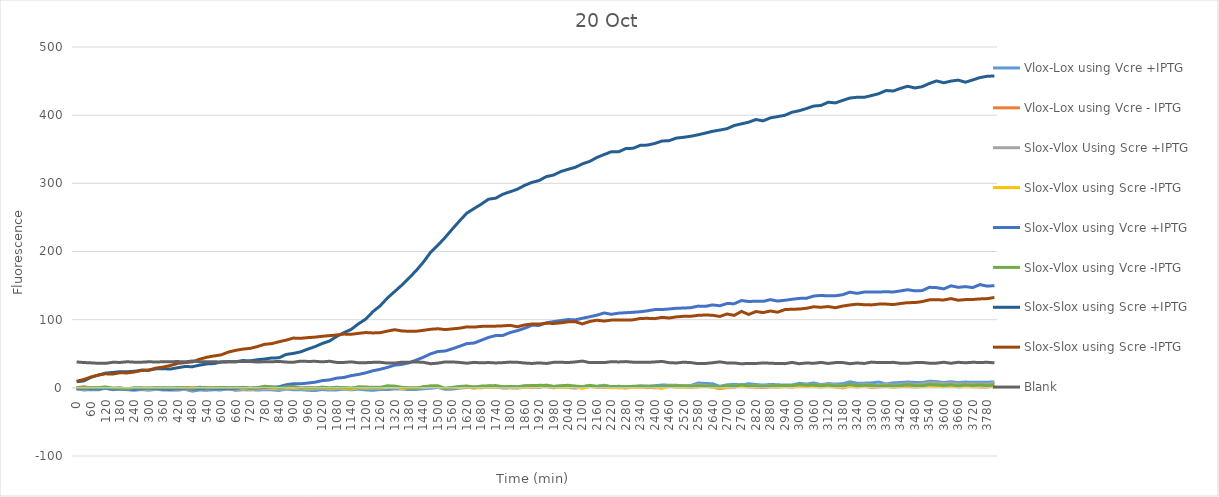
| Category | Vlox-Lox using Vcre +IPTG | Vlox-Lox using Vcre - IPTG | Slox-Vlox Using Scre +IPTG | Slox-Vlox using Scre -IPTG | Slox-Vlox using Vcre +IPTG | Slox-Vlox using Vcre -IPTG | Slox-Slox using Scre +IPTG | Slox-Slox using Scre -IPTG | Blank |
|---|---|---|---|---|---|---|---|---|---|
| 0.0 | -1.75 | 0.125 | -1.667 | -0.417 | -0.75 | 0.417 | 9 | 9.583 | 38 |
| 30.0 | -3.125 | 1.625 | -2.542 | -0.958 | -1.458 | -0.375 | 10.125 | 12.292 | 37.125 |
| 60.0 | -2.75 | -0.25 | -1.708 | 0.125 | -1.542 | 0.125 | 15.542 | 15.875 | 36.625 |
| 90.0 | -3 | -0.5 | -1.333 | 0.5 | -1.333 | 0.167 | 18.667 | 18.75 | 36 |
| 120.0 | -0.375 | 0.75 | -0.292 | 0.875 | -0.292 | 1.208 | 21.625 | 20.542 | 35.875 |
| 150.0 | -2.75 | -1.5 | -2.25 | -1.75 | -2.167 | -0.333 | 22.5 | 20.167 | 37.5 |
| 180.0 | -1.75 | 0 | -1.667 | -1.25 | -1.667 | -0.417 | 23.75 | 22.167 | 37.25 |
| 210.0 | -2.75 | -1.75 | -2.25 | -1.333 | -2.167 | -1.583 | 23.583 | 21.833 | 38.25 |
| 240.0 | -3.625 | -1.375 | -2.542 | -1.208 | -2.375 | 0.292 | 24.292 | 23.292 | 37.625 |
| 270.0 | -2 | -0.5 | -2.875 | -0.958 | -1.208 | -0.042 | 26.042 | 25.375 | 37.625 |
| 300.0 | -3.5 | -0.625 | -2.583 | -0.667 | -1.083 | -0.25 | 25.833 | 26.083 | 38.25 |
| 330.0 | -2 | -0.625 | -1.125 | -0.458 | -0.792 | 0.125 | 27.875 | 29.042 | 37.875 |
| 360.0 | -3.25 | -1.125 | -2.417 | -0.25 | -2.083 | 0 | 28 | 30.5 | 38.25 |
| 390.0 | -3.25 | -0.5 | -2.708 | -1.125 | -2.375 | 0.125 | 27.625 | 32.792 | 38.375 |
| 420.0 | -3.125 | -0.625 | -3 | -0.25 | -1.25 | 0.333 | 29.5 | 35.833 | 38.5 |
| 450.0 | -2.25 | 0.625 | -2.042 | -0.875 | -1.042 | -0.208 | 31.292 | 37.042 | 38.125 |
| 480.0 | -4.875 | 0 | -3.458 | -1.875 | -2.292 | -0.875 | 30.958 | 37.958 | 39.375 |
| 510.0 | -3.25 | 0 | -1.75 | -1.583 | -1.583 | 0.833 | 33.25 | 41.917 | 38.25 |
| 540.0 | -3.5 | -1.75 | -1.333 | 0.083 | -0.5 | 0.25 | 35.083 | 44.833 | 38.25 |
| 570.0 | -2.875 | 0.625 | -1.458 | -0.458 | -1.375 | -0.125 | 35.625 | 46.792 | 38.375 |
| 600.0 | -3.125 | -0.25 | -1.583 | 0.417 | -1.083 | 0.583 | 38 | 48.333 | 37.75 |
| 630.0 | -1.25 | 0.25 | -1.708 | 0.042 | -1.208 | 0.208 | 38.458 | 52.458 | 38.125 |
| 660.0 | -3.5 | 0.125 | -3.125 | -0.792 | -1.208 | -0.042 | 38.208 | 54.958 | 38.375 |
| 690.0 | -2.75 | -1 | -2.458 | 0.125 | 0.708 | 0.458 | 40.042 | 56.792 | 38.625 |
| 720.0 | -2.625 | -1.625 | -2.875 | -1.875 | -0.542 | -0.292 | 39.542 | 57.875 | 38.625 |
| 750.0 | -3.25 | -0.375 | -1.958 | -0.375 | -0.042 | 0.292 | 41.208 | 60.458 | 37.875 |
| 780.0 | -2.75 | 0.5 | -1.917 | -0.083 | 0.417 | 2.333 | 42.25 | 63.833 | 38.25 |
| 810.0 | -2.875 | 0.375 | -1.5 | -0.583 | 1.167 | 1.417 | 43.833 | 64.833 | 38.25 |
| 840.0 | -3.875 | 0.25 | -2.167 | -0.5 | 1.5 | -0.417 | 44 | 67.583 | 38.75 |
| 870.0 | -1.75 | 0.625 | -1.583 | 0.667 | 4.583 | 1.417 | 49 | 70 | 37.75 |
| 900.0 | -2.75 | 1.875 | -0.5 | 0 | 6 | 1.833 | 50.5 | 73 | 37.5 |
| 930.0 | -2.625 | -0.625 | -1.875 | -0.292 | 5.875 | -0.292 | 52.792 | 72.625 | 39.125 |
| 960.0 | -3.625 | 0.375 | -2.167 | -0.667 | 7 | 0.25 | 56.833 | 73.667 | 38.75 |
| 990.0 | -4 | -0.5 | -1.708 | -0.542 | 8.292 | -0.125 | 60.458 | 74.375 | 38.875 |
| 1020.0 | -2.5 | -0.125 | -0.542 | 0.792 | 10.625 | 1.042 | 65.125 | 75.625 | 38.125 |
| 1050.0 | -3.25 | -1.5 | -1.75 | -1.083 | 11.583 | 0.083 | 68.667 | 76.583 | 39 |
| 1080.0 | -3 | -0.25 | -0.75 | 0.167 | 14.25 | 0.833 | 75.5 | 77.5 | 37.25 |
| 1110.0 | -1.875 | 0.25 | -0.75 | -0.833 | 15.25 | 0.083 | 81 | 78.833 | 37.25 |
| 1140.0 | -3 | -1 | -1.208 | -2.125 | 17.875 | -0.125 | 85.792 | 78.542 | 38.125 |
| 1170.0 | -1.875 | 1.25 | 0.083 | 0.417 | 19.667 | 1.083 | 93.917 | 79.917 | 36.75 |
| 1200.0 | -3 | 0.625 | -0.875 | -0.042 | 21.958 | 1.125 | 100.708 | 81.125 | 36.875 |
| 1230.0 | -3.75 | 0.5 | -0.542 | 0.125 | 25.042 | 0.875 | 111.708 | 80.542 | 37.375 |
| 1260.0 | -2.5 | -0.75 | -0.667 | 0.167 | 27.167 | 0.667 | 120.25 | 80.917 | 37.5 |
| 1290.0 | -2.625 | 1.375 | 0.417 | 1 | 29.917 | 3 | 131.667 | 83.167 | 36.25 |
| 1320.0 | -1.5 | 1.375 | 1.75 | 1.417 | 33.25 | 2.583 | 141.167 | 85.25 | 36.25 |
| 1350.0 | -1.75 | -0.125 | -0.208 | -1.375 | 34.375 | 0.792 | 150.625 | 83.542 | 37.625 |
| 1380.0 | -2.625 | -0.25 | 0.458 | 0.375 | 36.708 | -0.125 | 161.208 | 82.875 | 37.625 |
| 1410.0 | -2.375 | 0.125 | 0.333 | -0.25 | 40.75 | -0.5 | 172.083 | 83 | 38 |
| 1440.0 | -1.375 | 0.75 | 0.292 | 0.792 | 44.958 | 1.792 | 184.625 | 84.375 | 37.375 |
| 1470.0 | -0.5 | 2.625 | 1.875 | 2.292 | 49.958 | 2.708 | 199.042 | 85.958 | 35.375 |
| 1500.0 | 0.5 | 1.625 | 1.667 | 1.917 | 53.25 | 3.083 | 209.25 | 86.667 | 36.25 |
| 1530.0 | -2.125 | -1 | -0.417 | -1.083 | 54 | -1.167 | 220.667 | 85.417 | 38 |
| 1560.0 | -1.875 | 0.125 | 0.5 | 0.333 | 57.333 | 0.667 | 233 | 86.5 | 38 |
| 1590.0 | -0.375 | 0.375 | 0.917 | 0.583 | 61 | 2 | 245 | 87.5 | 37.25 |
| 1620.0 | 0.5 | 1.125 | 2.125 | 1.792 | 64.875 | 2.708 | 256.375 | 89.458 | 36.125 |
| 1650.0 | 0.125 | 0.5 | 1.458 | -0.792 | 65.708 | 0.875 | 262.958 | 89.125 | 37.375 |
| 1680.0 | 0.125 | 0.875 | 1.208 | 1.542 | 69.792 | 2.625 | 269.458 | 90.125 | 36.625 |
| 1710.0 | 1.125 | 0.625 | 2.708 | 0.792 | 73.958 | 2.875 | 276.708 | 90.375 | 37.125 |
| 1740.0 | 1.125 | 1.625 | 1.667 | 1.833 | 76.667 | 3.333 | 278.25 | 90.5 | 36.5 |
| 1770.0 | -0.25 | 0.75 | 1.083 | 0.833 | 76.917 | 1.5 | 284.083 | 90.917 | 37 |
| 1800.0 | 0 | 0.75 | 2 | 1 | 81.167 | 2.083 | 287.667 | 91.667 | 37.75 |
| 1830.0 | -0.375 | 0.375 | 1.25 | 0.417 | 83.917 | 1.667 | 291.417 | 89.583 | 37.5 |
| 1860.0 | 0.875 | 2.125 | 3.042 | 0.958 | 87.458 | 2.792 | 297.042 | 92.292 | 36.375 |
| 1890.0 | 2 | 0.625 | 3.25 | 2.25 | 91.75 | 3.417 | 301.333 | 93.583 | 35.75 |
| 1920.0 | 0.5 | 2 | 2.042 | 1.792 | 91.542 | 3.625 | 304.125 | 93.458 | 36.625 |
| 1950.0 | 2.625 | 1.625 | 4.083 | 2.583 | 95.417 | 3.583 | 309.917 | 94.75 | 35.75 |
| 1980.0 | 0 | 0.875 | 1.958 | 1.125 | 97.125 | 2.042 | 312.125 | 94.458 | 37.375 |
| 2010.0 | 1.125 | 1.625 | 2.667 | 0.833 | 98.667 | 3.083 | 317.333 | 95.333 | 37.5 |
| 2040.0 | 0.5 | 1.125 | 2.542 | 0.958 | 100.208 | 3.708 | 320.542 | 96.792 | 37.125 |
| 2070.0 | -0.375 | 0.875 | 1.667 | 1.5 | 99.667 | 2.583 | 323.5 | 96.917 | 38 |
| 2100.0 | 1.5 | 0.125 | 1.917 | -0.833 | 102.083 | 1.75 | 328.583 | 93.75 | 39.25 |
| 2130.0 | 2.25 | 2 | 2.5 | 2.25 | 104.25 | 3.667 | 332.167 | 97.333 | 37 |
| 2160.0 | 2 | 1 | 2.125 | 1.875 | 106.625 | 2.042 | 337.958 | 99.208 | 37.125 |
| 2190.0 | 3.75 | 0.625 | 3.167 | 1.417 | 109.833 | 2.667 | 342.25 | 97.917 | 37 |
| 2220.0 | 1.375 | 0.75 | 1.875 | -0.042 | 107.875 | 1.792 | 346.375 | 99.375 | 38.375 |
| 2250.0 | 2.25 | 0.125 | 1.083 | 0.583 | 109.583 | 2 | 346.25 | 99.583 | 38 |
| 2280.0 | 1.625 | -0.125 | 1.917 | 0.667 | 110.167 | 1.667 | 351 | 99.417 | 38.5 |
| 2310.0 | 0.875 | 0.875 | 1.708 | 0.625 | 110.875 | 2.208 | 351.375 | 99.708 | 37.625 |
| 2340.0 | 2.375 | 1.25 | 2.958 | 0.708 | 111.625 | 2.458 | 355.708 | 101.792 | 37.625 |
| 2370.0 | 2.25 | 0.5 | 2.542 | 1.625 | 112.958 | 1.625 | 356.125 | 101.958 | 37.375 |
| 2400.0 | 3.125 | 0.25 | 2 | 1.333 | 114.75 | 2.25 | 358.5 | 101.5 | 38 |
| 2430.0 | 4.125 | -0.25 | 1.5 | -0.667 | 114.833 | 2 | 362.083 | 103.417 | 38.75 |
| 2460.0 | 3.875 | 2.375 | 3.625 | 2.042 | 115.708 | 2.792 | 362.625 | 102.458 | 36.875 |
| 2490.0 | 3.875 | 1.25 | 3.167 | 1.25 | 116.75 | 2.917 | 366.417 | 104.083 | 36.5 |
| 2520.0 | 1.875 | 1.125 | 2.542 | 1.208 | 117.042 | 3.208 | 367.542 | 104.958 | 37.625 |
| 2550.0 | 3.375 | 0.875 | 2.833 | 1.583 | 117.583 | 2.333 | 369.083 | 105 | 37 |
| 2580.0 | 7.125 | 1.5 | 4.583 | 1.75 | 119.917 | 2.75 | 371.25 | 106.333 | 35.5 |
| 2610.0 | 6.375 | 2.875 | 3 | 2.5 | 119.5 | 2.5 | 373.667 | 106.833 | 35.75 |
| 2640.0 | 6 | 1.125 | 2.333 | 0.583 | 121.667 | 2.5 | 376.333 | 106.5 | 36.75 |
| 2670.0 | 2.25 | -1.25 | 1.625 | -0.542 | 120.375 | 1.042 | 378.125 | 104.708 | 38.125 |
| 2700.0 | 4.375 | 0.5 | 3 | 1.333 | 123.667 | 3.333 | 380.167 | 108.333 | 36.5 |
| 2730.0 | 5.125 | 1.125 | 2.667 | 1.667 | 123.417 | 2 | 384.833 | 106.333 | 36.5 |
| 2760.0 | 4.25 | 3 | 4.75 | 2 | 128.083 | 4.417 | 387.25 | 112.167 | 35.25 |
| 2790.0 | 6 | 1.625 | 2.792 | 1.458 | 126.625 | 2.375 | 389.708 | 107.625 | 35.875 |
| 2820.0 | 4.875 | 0.875 | 3.917 | 2.083 | 127.083 | 3 | 393.583 | 111.917 | 35.75 |
| 2850.0 | 4 | 0.5 | 2.333 | 1.167 | 126.833 | 1.417 | 391.667 | 110.417 | 36.5 |
| 2880.0 | 5 | 1.25 | 3.875 | 2.458 | 129.375 | 2.875 | 396.042 | 112.708 | 36.125 |
| 2910.0 | 4.5 | 1.375 | 2.708 | 1.042 | 127.292 | 3.208 | 397.875 | 110.958 | 35.625 |
| 2940.0 | 4 | 1.875 | 3.167 | 2.083 | 128.417 | 3.417 | 399.833 | 114.75 | 35.5 |
| 2970.0 | 4.125 | 1.25 | 3.25 | 1.167 | 129.917 | 3.167 | 404.333 | 115.333 | 37.25 |
| 3000.0 | 6.625 | 2.625 | 3.958 | 3.625 | 131.208 | 4.792 | 406.542 | 115.542 | 35.375 |
| 3030.0 | 5.625 | 2.125 | 4.75 | 1.417 | 131.417 | 3.833 | 409.75 | 116.75 | 36.5 |
| 3060.0 | 7.125 | 2.875 | 4.333 | 2.583 | 134.667 | 4.083 | 413.417 | 118.917 | 36 |
| 3090.0 | 4.75 | 2 | 4.083 | 0.917 | 135.583 | 2.833 | 414.25 | 118.167 | 37.25 |
| 3120.0 | 6.25 | 2 | 5.333 | 2.417 | 134.917 | 4.25 | 419 | 119.25 | 35.75 |
| 3150.0 | 5.5 | 1.75 | 4.333 | 1 | 135.083 | 2.5 | 418 | 117.5 | 37 |
| 3180.0 | 6 | -0.125 | 3.375 | 0.958 | 136.542 | 2.625 | 421.625 | 119.958 | 37.125 |
| 3210.0 | 8.875 | 2.875 | 5.292 | 3.292 | 140.375 | 5.208 | 425.125 | 121.542 | 35.375 |
| 3240.0 | 6.75 | 2 | 3.75 | 0.833 | 138.583 | 3 | 426.25 | 122.75 | 36.5 |
| 3270.0 | 6.875 | 3.25 | 5.417 | 2.917 | 140.5 | 4 | 426.25 | 121.917 | 35.75 |
| 3300.0 | 7.25 | 0.375 | 3.917 | 1.417 | 140.667 | 3.333 | 428.75 | 121.667 | 37.75 |
| 3330.0 | 8.5 | 1.375 | 3.833 | 2.167 | 140.583 | 2.5 | 431.5 | 122.833 | 37 |
| 3360.0 | 5.625 | 2 | 5.292 | 3.042 | 140.958 | 3.208 | 436.125 | 122.875 | 37.125 |
| 3390.0 | 7.375 | 1.25 | 4.042 | 0.792 | 140.625 | 2.625 | 435.458 | 122.125 | 37.375 |
| 3420.0 | 7.75 | 1.75 | 5 | 2.167 | 142.167 | 3.25 | 439.25 | 123.667 | 36 |
| 3450.0 | 8.625 | 2.125 | 6.083 | 4.5 | 143.917 | 4.833 | 442.417 | 124.917 | 36 |
| 3480.0 | 7.875 | 1.375 | 4.667 | 1.583 | 142.25 | 3 | 439.917 | 125.083 | 37 |
| 3510.0 | 7.625 | 2.125 | 5.5 | 1.75 | 142.667 | 3.167 | 441.75 | 126.5 | 37.25 |
| 3540.0 | 9.75 | 2.875 | 7.542 | 3.458 | 147.458 | 4.958 | 446.458 | 129.042 | 36.125 |
| 3570.0 | 9.125 | 2.125 | 7.25 | 2 | 147 | 4.333 | 450.25 | 129.167 | 36.25 |
| 3600.0 | 7.75 | 1.625 | 6.083 | 2.25 | 145.167 | 3.5 | 447.5 | 128.917 | 37.5 |
| 3630.0 | 9 | 3 | 6.833 | 3 | 149.667 | 4.583 | 450 | 130.917 | 36 |
| 3660.0 | 7.625 | 1.375 | 5.75 | 1.667 | 147.417 | 2.75 | 451.417 | 128.5 | 37.5 |
| 3690.0 | 8.5 | 2.25 | 5.833 | 1.833 | 148.5 | 4.417 | 448.333 | 129.417 | 36.75 |
| 3720.0 | 8 | 1.75 | 5.917 | 1.75 | 147.083 | 3.417 | 451.667 | 129.583 | 37.5 |
| 3750.0 | 8.25 | 1.375 | 6.042 | 3.042 | 151.458 | 4.292 | 455.125 | 130.458 | 37.125 |
| 3780.0 | 8.125 | 1.25 | 5.333 | 2.417 | 149.167 | 3.167 | 457.083 | 130.833 | 37.5 |
| 3810.0 | 8.875 | 2.625 | 7.708 | 3.792 | 149.875 | 4.458 | 457.458 | 132.542 | 36.625 |